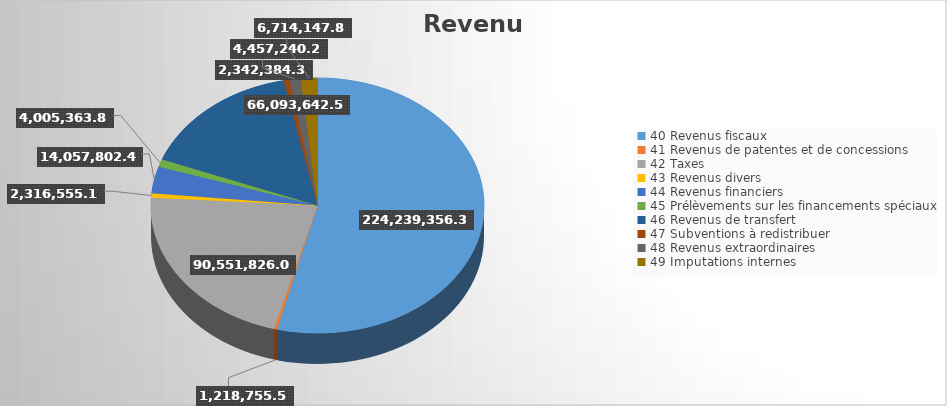
| Category | Series 0 |
|---|---|
| 40 Revenus fiscaux | 224239356.33 |
| 41 Revenus de patentes et de concessions | 1218755.56 |
| 42 Taxes | 90551826.06 |
| 43 Revenus divers | 2316555.17 |
| 44 Revenus financiers | 14057802.46 |
| 45 Prélèvements sur les financements spéciaux | 4005363.81 |
| 46 Revenus de transfert | 66093642.56 |
| 47 Subventions à redistribuer | 2342384.3 |
| 48 Revenus extraordinaires | 4457240.22 |
| 49 Imputations internes | 6714147.82 |